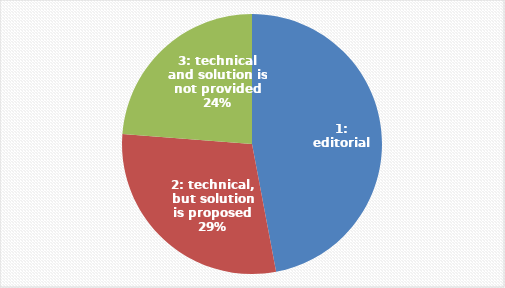
| Category | Series 0 |
|---|---|
| 1: editorial | 95 |
| 2: technical, but solution is proposed | 59 |
| 3: technical and solution is not provided | 48 |